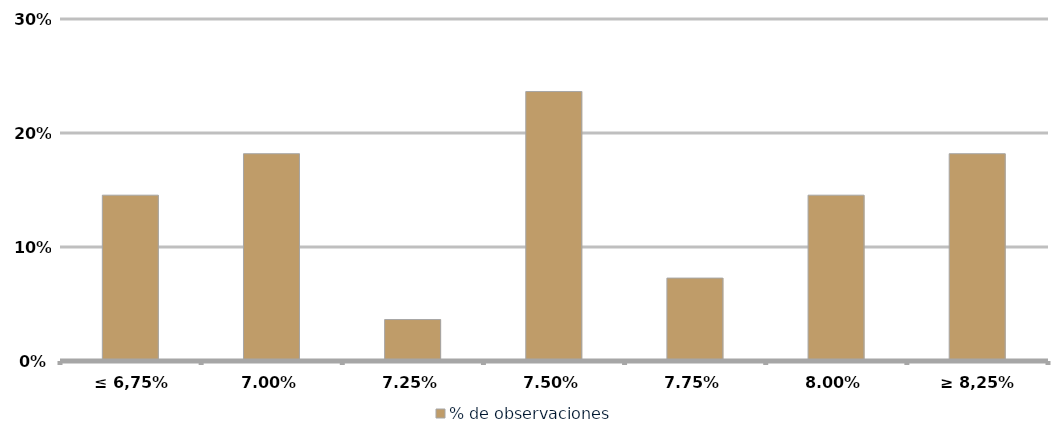
| Category | % de observaciones  |
|---|---|
| ≤ 6,75% | 0.145 |
| 7,00% | 0.182 |
| 7,25% | 0.036 |
| 7,50% | 0.236 |
| 7,75% | 0.073 |
| 8,00% | 0.145 |
| ≥ 8,25% | 0.182 |